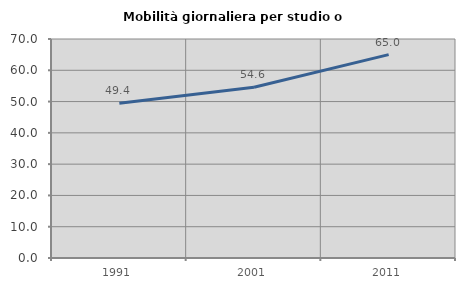
| Category | Mobilità giornaliera per studio o lavoro |
|---|---|
| 1991.0 | 49.43 |
| 2001.0 | 54.598 |
| 2011.0 | 65.009 |